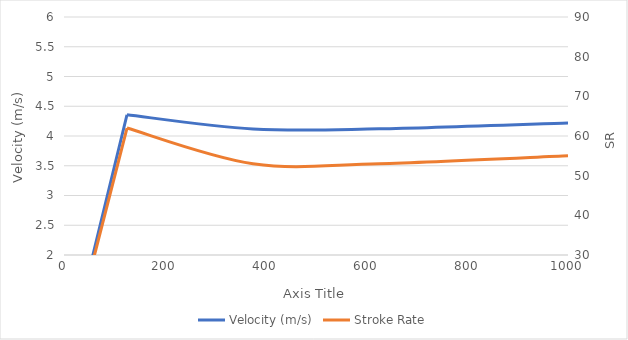
| Category | Velocity (m/s) |
|---|---|
| 0.0 | 0 |
| 125.0 | 4.357 |
| 375.0 | 4.118 |
| 625.0 | 4.12 |
| 1000.0 | 4.219 |